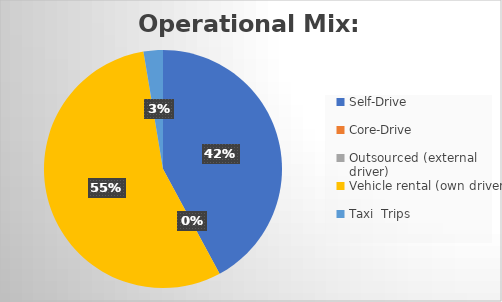
| Category | Missions |
|---|---|
| Self-Drive | 16 |
| Core-Drive | 0 |
| Outsourced (external driver) | 0 |
| Vehicle rental (own driver) | 21 |
| Taxi  Trips | 1 |